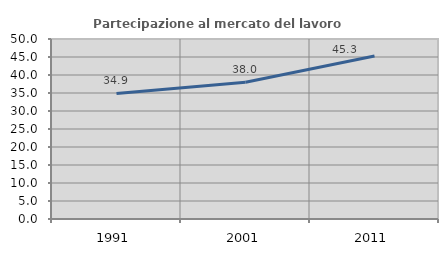
| Category | Partecipazione al mercato del lavoro  femminile |
|---|---|
| 1991.0 | 34.871 |
| 2001.0 | 38.01 |
| 2011.0 | 45.263 |